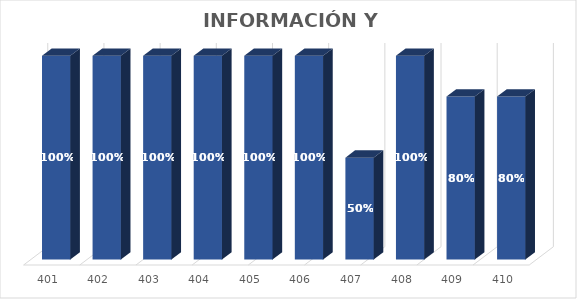
| Category | % Avance |
|---|---|
| 401.0 | 1 |
| 402.0 | 1 |
| 403.0 | 1 |
| 404.0 | 1 |
| 405.0 | 1 |
| 406.0 | 1 |
| 407.0 | 0.5 |
| 408.0 | 1 |
| 409.0 | 0.8 |
| 410.0 | 0.8 |